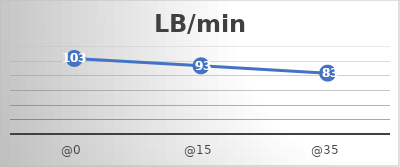
| Category | LB/min |
|---|---|
| @0 | 103 |
| @15 | 93 |
| @35 | 83 |